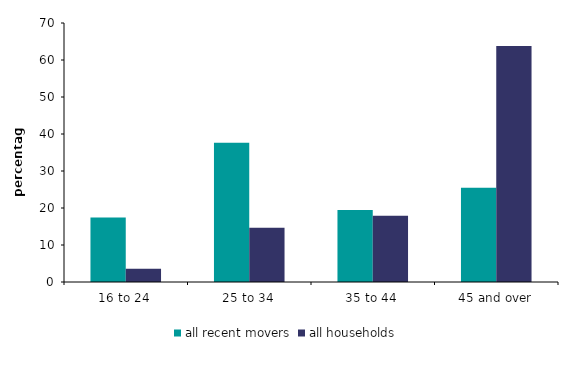
| Category | all recent movers | all households |
|---|---|---|
| 16 to 24 | 17.417 | 3.606 |
| 25 to 34 | 37.602 | 14.669 |
| 35 to 44 | 19.478 | 17.93 |
| 45 and over | 25.503 | 63.795 |